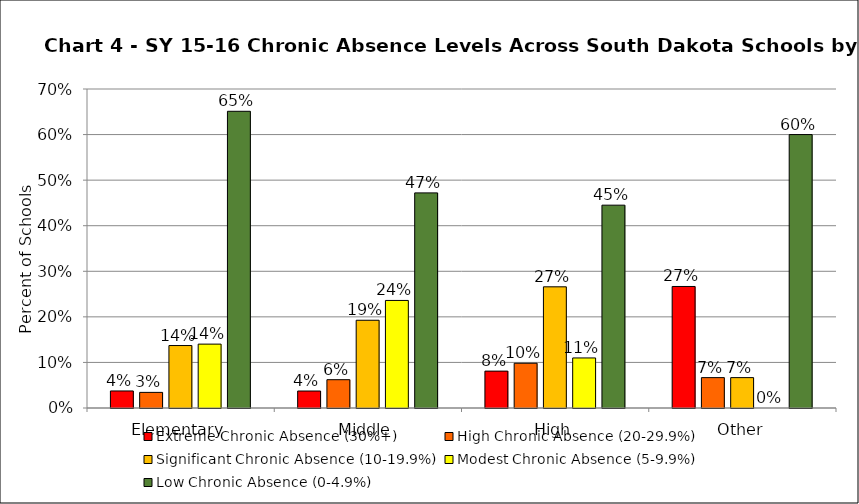
| Category | Extreme Chronic Absence (30%+) | High Chronic Absence (20-29.9%) | Significant Chronic Absence (10-19.9%) | Modest Chronic Absence (5-9.9%) | Low Chronic Absence (0-4.9%) |
|---|---|---|---|---|---|
| 0 | 0.037 | 0.034 | 0.137 | 0.14 | 0.651 |
| 1 | 0.037 | 0.062 | 0.193 | 0.236 | 0.472 |
| 2 | 0.081 | 0.098 | 0.266 | 0.11 | 0.445 |
| 3 | 0.267 | 0.067 | 0.067 | 0 | 0.6 |